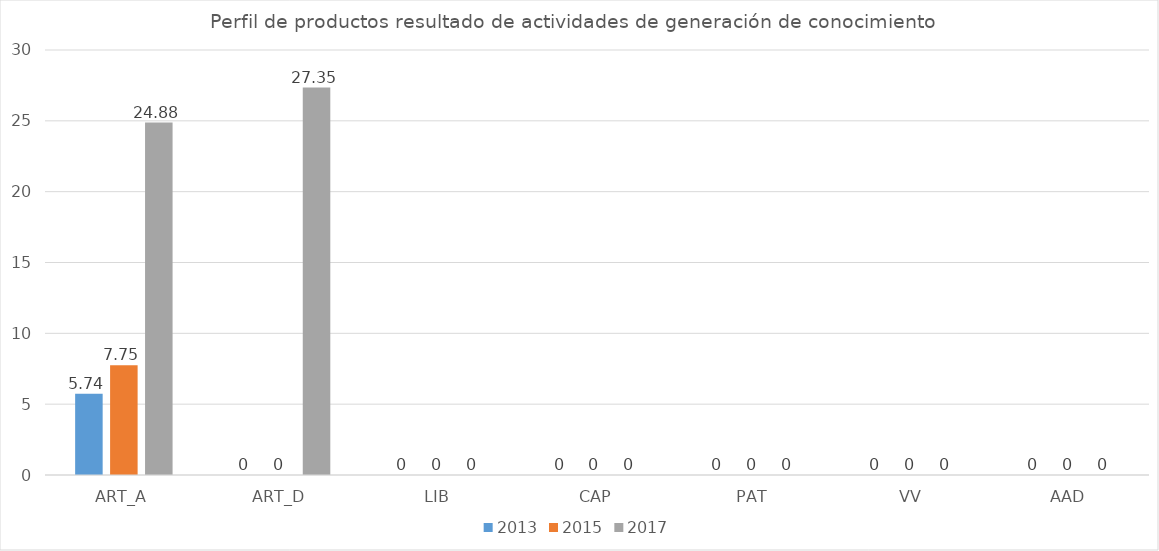
| Category | 2013 | 2015 | 2017 |
|---|---|---|---|
| ART_A | 5.74 | 7.75 | 24.88 |
| ART_D | 0 | 0 | 27.35 |
| LIB | 0 | 0 | 0 |
| CAP | 0 | 0 | 0 |
| PAT | 0 | 0 | 0 |
| VV | 0 | 0 | 0 |
| AAD | 0 | 0 | 0 |